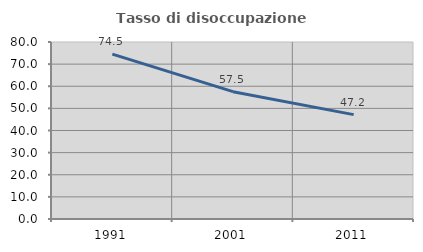
| Category | Tasso di disoccupazione giovanile  |
|---|---|
| 1991.0 | 74.51 |
| 2001.0 | 57.547 |
| 2011.0 | 47.183 |